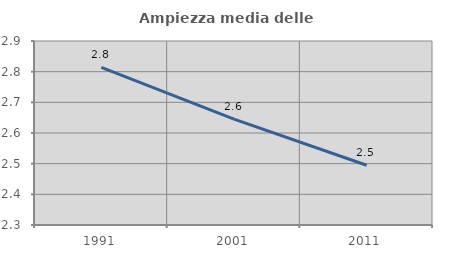
| Category | Ampiezza media delle famiglie |
|---|---|
| 1991.0 | 2.814 |
| 2001.0 | 2.645 |
| 2011.0 | 2.495 |